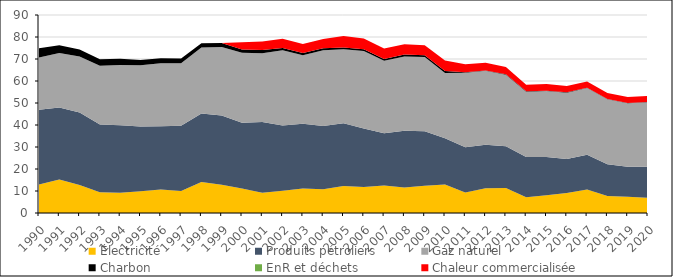
| Category | Électricité | Produits pétroliers | Gaz naturel | Charbon | EnR et déchets | Chaleur commercialisée |
|---|---|---|---|---|---|---|
| 1990.0 | 12.961 | 33.923 | 23.819 | 4.238 | 0 | 0 |
| 1991.0 | 15.274 | 32.692 | 24.746 | 3.561 | 0 | 0 |
| 1992.0 | 12.677 | 32.956 | 25.484 | 3.168 | 0 | 0 |
| 1993.0 | 9.405 | 30.822 | 26.713 | 2.896 | 0 | 0 |
| 1994.0 | 9.242 | 30.644 | 27.383 | 2.796 | 0 | 0 |
| 1995.0 | 9.882 | 29.487 | 27.806 | 2.341 | 0 | 0 |
| 1996.0 | 10.711 | 28.734 | 28.606 | 2.246 | 0 | 0 |
| 1997.0 | 10.049 | 29.563 | 28.469 | 2.154 | 0 | 0 |
| 1998.0 | 14.051 | 31.179 | 30.007 | 1.865 | 0 | 0 |
| 1999.0 | 12.858 | 31.512 | 31.128 | 1.778 | 0 | 0 |
| 2000.0 | 11.175 | 29.873 | 31.737 | 1.481 | 0 | 3.296 |
| 2001.0 | 9.208 | 32.125 | 31.31 | 1.443 | 0 | 3.914 |
| 2002.0 | 10.12 | 29.64 | 34.221 | 1.003 | 0 | 4.197 |
| 2003.0 | 11.083 | 29.478 | 31.136 | 0.985 | 0 | 4.103 |
| 2004.0 | 10.818 | 28.758 | 34.388 | 0.955 | 0 | 4.142 |
| 2005.0 | 12.291 | 28.506 | 33.612 | 0.859 | 0 | 5.149 |
| 2006.0 | 11.789 | 26.665 | 35.141 | 0.834 | 0 | 4.873 |
| 2007.0 | 12.496 | 23.799 | 32.864 | 0.813 | 0 | 4.823 |
| 2008.0 | 11.625 | 25.745 | 33.783 | 0.901 | 0 | 4.68 |
| 2009.0 | 12.407 | 24.701 | 33.802 | 0.795 | 0 | 4.491 |
| 2010.0 | 12.954 | 21.06 | 29.589 | 0.892 | 0 | 4.811 |
| 2011.0 | 9.323 | 20.587 | 33.862 | 0.16 | 0 | 3.658 |
| 2012.0 | 11.298 | 19.778 | 33.527 | 0.178 | 0 | 3.47 |
| 2013.0 | 11.331 | 18.96 | 32.588 | 0.187 | 0 | 3.297 |
| 2014.0 | 7.206 | 18.197 | 29.759 | 0.139 | 0 | 2.956 |
| 2015.0 | 8.031 | 17.391 | 30.035 | 0.144 | 0 | 3.074 |
| 2016.0 | 9.072 | 15.486 | 30.141 | 0.149 | 0 | 2.916 |
| 2017.0 | 10.695 | 15.747 | 30.378 | 0.141 | 0 | 2.81 |
| 2018.0 | 7.682 | 14.469 | 29.545 | 0.104 | 0 | 2.732 |
| 2019.0 | 7.413 | 13.568 | 28.941 | 0.097 | 0 | 2.684 |
| 2020.0 | 6.889 | 14.08 | 29.411 | 0.082 | 0 | 2.714 |